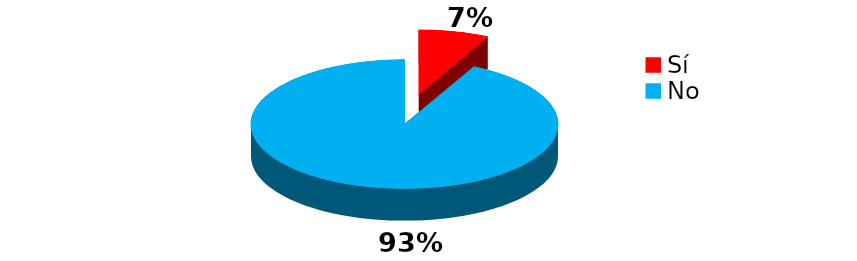
| Category | Series 0 |
|---|---|
| Sí | 8 |
| No | 100 |